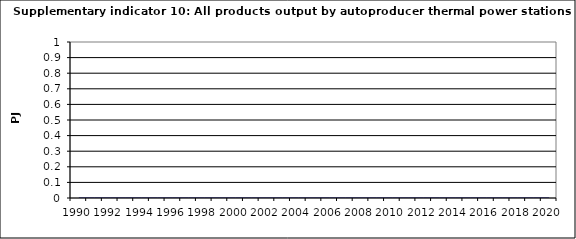
| Category | All products output by autoproducer thermal power stations, PJ |
|---|---|
| 1990 | 0 |
| 1991 | 0 |
| 1992 | 0 |
| 1993 | 0 |
| 1994 | 0 |
| 1995 | 0 |
| 1996 | 0 |
| 1997 | 0 |
| 1998 | 0 |
| 1999 | 0 |
| 2000 | 0 |
| 2001 | 0 |
| 2002 | 0 |
| 2003 | 0 |
| 2004 | 0 |
| 2005 | 0 |
| 2006 | 0 |
| 2007 | 0 |
| 2008 | 0 |
| 2009 | 0 |
| 2010 | 0 |
| 2011 | 0 |
| 2012 | 0 |
| 2013 | 0 |
| 2014 | 0 |
| 2015 | 0 |
| 2016 | 0 |
| 2017 | 0 |
| 2018 | 0 |
| 2019 | 0 |
| 2020 | 0 |